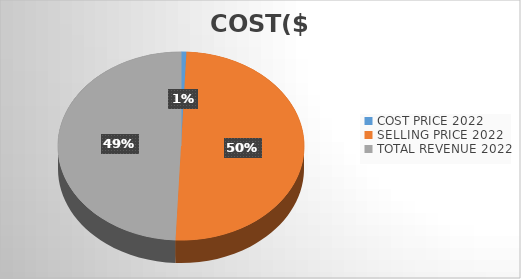
| Category | COST($) |
|---|---|
| COST PRICE 2022 | 615 |
| SELLING PRICE 2022 | 43436 |
| TOTAL REVENUE 2022 | 42821 |